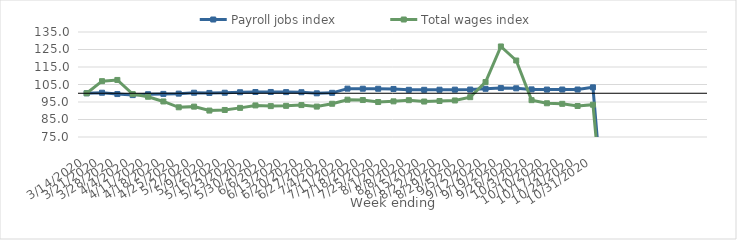
| Category | Payroll jobs index | Total wages index |
|---|---|---|
| 14/03/2020 | 100 | 100 |
| 21/03/2020 | 100.302 | 106.903 |
| 28/03/2020 | 99.54 | 107.602 |
| 04/04/2020 | 98.944 | 99.511 |
| 11/04/2020 | 99.446 | 97.997 |
| 18/04/2020 | 99.626 | 95.309 |
| 25/04/2020 | 99.776 | 91.982 |
| 02/05/2020 | 100.303 | 92.355 |
| 09/05/2020 | 100.176 | 90.1 |
| 16/05/2020 | 100.292 | 90.438 |
| 23/05/2020 | 100.578 | 91.643 |
| 30/05/2020 | 100.714 | 93.053 |
| 06/06/2020 | 100.724 | 92.655 |
| 13/06/2020 | 100.65 | 92.805 |
| 20/06/2020 | 100.584 | 93.233 |
| 27/06/2020 | 99.96 | 92.375 |
| 04/07/2020 | 100.243 | 94 |
| 11/07/2020 | 102.633 | 96.321 |
| 18/07/2020 | 102.596 | 96.124 |
| 25/07/2020 | 102.567 | 94.986 |
| 01/08/2020 | 102.45 | 95.367 |
| 08/08/2020 | 101.96 | 96.036 |
| 15/08/2020 | 101.965 | 95.266 |
| 22/08/2020 | 102.013 | 95.574 |
| 29/08/2020 | 102.055 | 95.884 |
| 05/09/2020 | 102.112 | 97.767 |
| 12/09/2020 | 102.552 | 106.41 |
| 19/09/2020 | 102.962 | 126.738 |
| 26/09/2020 | 102.824 | 118.707 |
| 03/10/2020 | 102.209 | 96.06 |
| 10/10/2020 | 102.102 | 94.275 |
| 17/10/2020 | 102.126 | 93.957 |
| 24/10/2020 | 102.129 | 92.721 |
| 31/10/2020 | 103.385 | 93.451 |